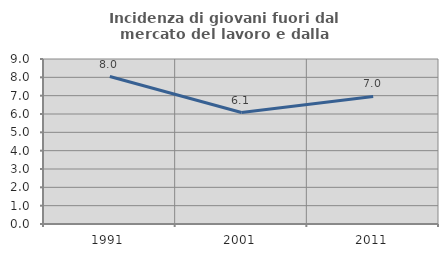
| Category | Incidenza di giovani fuori dal mercato del lavoro e dalla formazione  |
|---|---|
| 1991.0 | 8.043 |
| 2001.0 | 6.081 |
| 2011.0 | 6.958 |